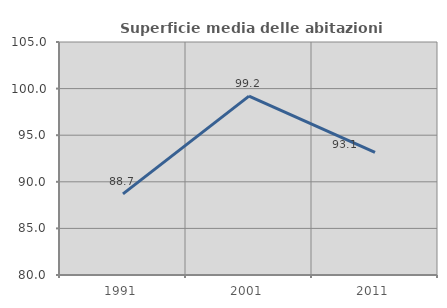
| Category | Superficie media delle abitazioni occupate |
|---|---|
| 1991.0 | 88.711 |
| 2001.0 | 99.194 |
| 2011.0 | 93.148 |